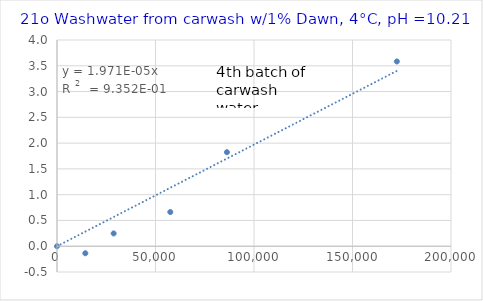
| Category | Series 0 |
|---|---|
| 0.0 | 0 |
| 14376.675603217156 | -0.137 |
| 28753.351206434312 | 0.248 |
| 57506.702412868624 | 0.663 |
| 86260.05361930294 | 1.824 |
| 172520.10723860588 | 3.584 |